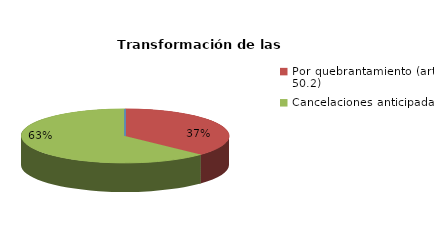
| Category | Series 0 |
|---|---|
| Reducciones y sustituciones (arts. 13 y 51) | 0 |
| Por quebrantamiento (art. 50.2) | 33 |
| Cancelaciones anticipadas | 56 |
| Traslado a Centros Penitenciarios | 0 |
| Conversión internamientos en cerrados (art. 51.2) | 0 |